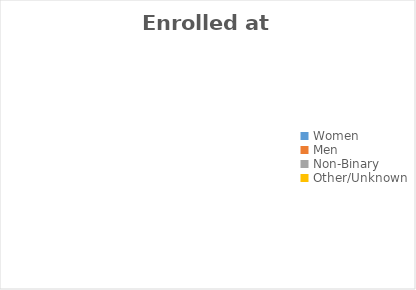
| Category | Enrolled at start | Referred | Screened | Accepted | Successful Outcome | Unsuccessful Outcome | Reunified with child(ren) | Enrolled at end of period |
|---|---|---|---|---|---|---|---|---|
| Women | 0 | 0 | 0 | 0 | 0 | 0 | 0 | 0 |
| Men | 0 | 0 | 0 | 0 | 0 | 0 | 0 | 0 |
| Non-Binary | 0 | 0 | 0 | 0 | 0 | 0 | 0 | 0 |
| Other/Unknown | 0 | 0 | 0 | 0 | 0 | 0 | 0 | 0 |